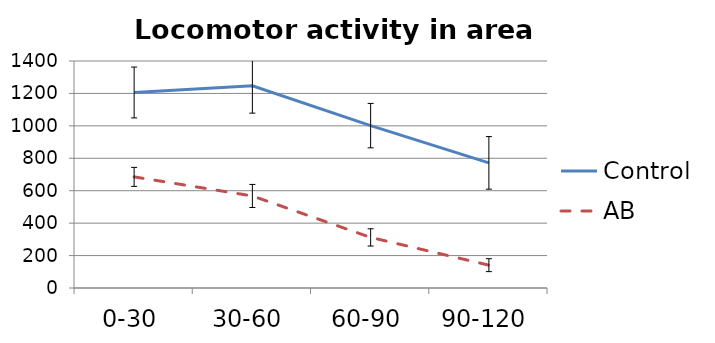
| Category | Control | AB |
|---|---|---|
| 0-30 | 1205.909 | 685.389 |
| 30-60 | 1247.091 | 567.667 |
| 60-90 | 1001.455 | 312 |
| 90-120 | 771.773 | 140.889 |